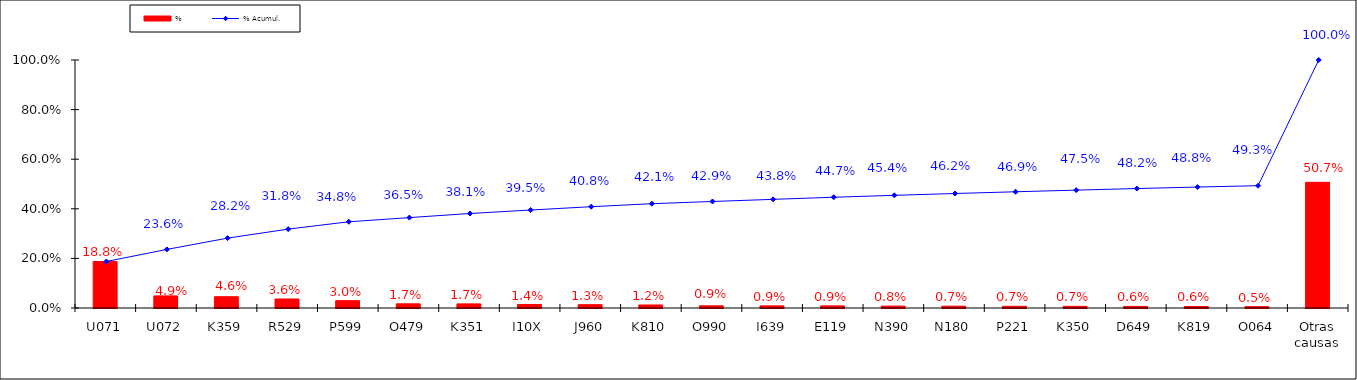
| Category | % |
|---|---|
| U071 | 0.188 |
| U072 | 0.049 |
| K359 | 0.046 |
| R529 | 0.036 |
| P599 | 0.03 |
| O479 | 0.017 |
| K351 | 0.017 |
| I10X | 0.014 |
| J960 | 0.013 |
| K810 | 0.012 |
| O990 | 0.009 |
| I639 | 0.009 |
| E119 | 0.009 |
| N390 | 0.008 |
| N180 | 0.007 |
| P221 | 0.007 |
| K350 | 0.007 |
| D649 | 0.006 |
| K819 | 0.006 |
| O064 | 0.005 |
| Otras causas | 0.507 |